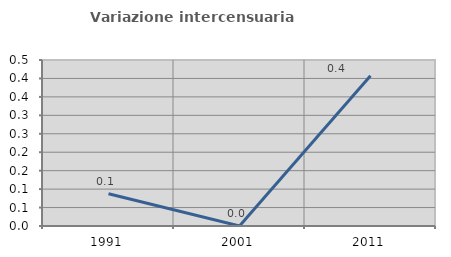
| Category | Variazione intercensuaria annua |
|---|---|
| 1991.0 | 0.087 |
| 2001.0 | 0 |
| 2011.0 | 0.407 |